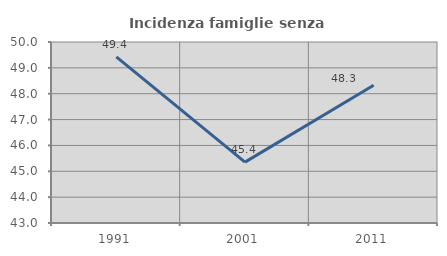
| Category | Incidenza famiglie senza nuclei |
|---|---|
| 1991.0 | 49.425 |
| 2001.0 | 45.355 |
| 2011.0 | 48.325 |